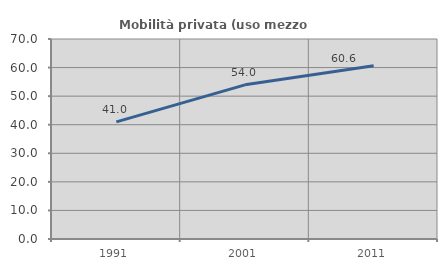
| Category | Mobilità privata (uso mezzo privato) |
|---|---|
| 1991.0 | 41.004 |
| 2001.0 | 53.953 |
| 2011.0 | 60.61 |